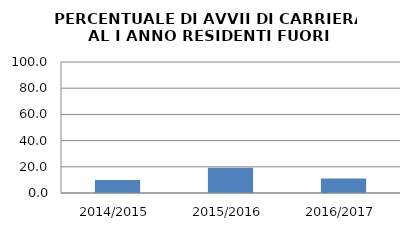
| Category | 2014/2015 2015/2016 2016/2017 |
|---|---|
| 2014/2015 | 10 |
| 2015/2016 | 19.355 |
| 2016/2017 | 11.111 |